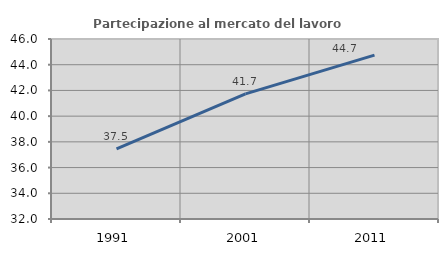
| Category | Partecipazione al mercato del lavoro  femminile |
|---|---|
| 1991.0 | 37.461 |
| 2001.0 | 41.736 |
| 2011.0 | 44.747 |